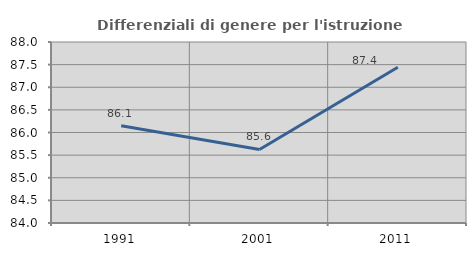
| Category | Differenziali di genere per l'istruzione superiore |
|---|---|
| 1991.0 | 86.149 |
| 2001.0 | 85.625 |
| 2011.0 | 87.441 |